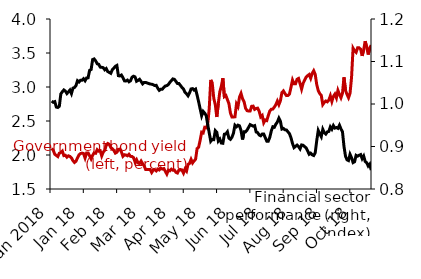
| Category | 10-Year Bond Yield |
|---|---|
| Jan 2018 | 2.099 |
| Jan 18 | 2.068 |
| Jan 18 | 2.011 |
| Jan 18 | 1.994 |
| Jan 18 | 1.977 |
| Jan 18 | 2.028 |
| Jan 18 | 2.038 |
| Jan 18 | 2.058 |
| Jan 18 | 1.991 |
| Jan 18 | 1.996 |
| Jan 18 | 1.968 |
| Jan 18 | 1.988 |
| Jan 18 | 1.979 |
| Jan 18 | 1.958 |
| Jan 18 | 1.917 |
| Jan 18 | 1.89 |
| Jan 18 | 1.908 |
| Jan 18 | 1.958 |
| Jan 18 | 2.003 |
| Jan 18 | 2.021 |
| Jan 18 | 2.028 |
| Jan 18 | 2.021 |
| Feb 18 | 1.956 |
| Feb 18 | 2.031 |
| Feb 18 | 2.031 |
| Feb 18 | 1.988 |
| Feb 18 | 1.943 |
| Feb 18 | 1.995 |
| Feb 18 | 2.033 |
| Feb 18 | 2.026 |
| Feb 18 | 2.078 |
| Feb 18 | 2.057 |
| Feb 18 | 2.063 |
| Feb 18 | 1.986 |
| Feb 18 | 2.042 |
| Feb 18 | 2.069 |
| Feb 18 | 2.143 |
| Feb 18 | 2.169 |
| Feb 18 | 2.156 |
| Feb 18 | 2.109 |
| Feb 18 | 2.093 |
| Feb 18 | 2.068 |
| Mar 18 | 2.028 |
| Mar 18 | 2.04 |
| Mar 18 | 2.082 |
| Mar 18 | 2.087 |
| Mar 18 | 2.045 |
| Mar 18 | 1.981 |
| Mar 18 | 2.004 |
| Mar 18 | 1.999 |
| Mar 18 | 1.988 |
| Mar 18 | 2.01 |
| Mar 18 | 1.98 |
| Mar 18 | 1.978 |
| Mar 18 | 1.962 |
| Mar 18 | 1.896 |
| Mar 18 | 1.932 |
| Mar 18 | 1.882 |
| Mar 18 | 1.874 |
| Mar 18 | 1.911 |
| Mar 18 | 1.873 |
| Mar 18 | 1.841 |
| Mar 18 | 1.787 |
| Mar 18 | 1.787 |
| Apr 18 | 1.787 |
| Apr 18 | 1.786 |
| Apr 18 | 1.743 |
| Apr 18 | 1.777 |
| Apr 18 | 1.784 |
| Apr 18 | 1.766 |
| Apr 18 | 1.793 |
| Apr 18 | 1.78 |
| Apr 18 | 1.808 |
| Apr 18 | 1.793 |
| Apr 18 | 1.8 |
| Apr 18 | 1.76 |
| Apr 18 | 1.719 |
| Apr 18 | 1.777 |
| Apr 18 | 1.768 |
| Apr 18 | 1.792 |
| Apr 18 | 1.776 |
| Apr 18 | 1.779 |
| Apr 18 | 1.745 |
| Apr 18 | 1.735 |
| Apr 18 | 1.78 |
| May 18 | 1.78 |
| May 18 | 1.78 |
| May 18 | 1.734 |
| May 18 | 1.793 |
| May 18 | 1.763 |
| May 18 | 1.862 |
| May 18 | 1.876 |
| May 18 | 1.935 |
| May 18 | 1.883 |
| May 18 | 1.913 |
| May 18 | 1.938 |
| May 18 | 2.095 |
| May 18 | 2.114 |
| May 18 | 2.217 |
| May 18 | 2.335 |
| May 18 | 2.325 |
| May 18 | 2.407 |
| May 18 | 2.4 |
| May 18 | 2.453 |
| May 18 | 2.682 |
| May 18 | 3.104 |
| May 18 | 3.054 |
| May 18 | 2.836 |
| Jun 18 | 2.739 |
| Jun 18 | 2.559 |
| Jun 18 | 2.758 |
| Jun 18 | 2.931 |
| Jun 18 | 3.012 |
| Jun 18 | 3.13 |
| Jun 18 | 2.859 |
| Jun 18 | 2.874 |
| Jun 18 | 2.815 |
| Jun 18 | 2.755 |
| Jun 18 | 2.617 |
| Jun 18 | 2.559 |
| Jun 18 | 2.56 |
| Jun 18 | 2.561 |
| Jun 18 | 2.751 |
| Jun 18 | 2.712 |
| Jun 18 | 2.853 |
| Jun 18 | 2.906 |
| Jun 18 | 2.828 |
| Jun 18 | 2.785 |
| Jun 18 | 2.688 |
| Jul 18 | 2.652 |
| Jul 18 | 2.647 |
| Jul 18 | 2.646 |
| Jul 18 | 2.716 |
| Jul 18 | 2.719 |
| Jul 18 | 2.671 |
| Jul 18 | 2.684 |
| Jul 18 | 2.689 |
| Jul 18 | 2.642 |
| Jul 18 | 2.56 |
| Jul 18 | 2.581 |
| Jul 18 | 2.475 |
| Jul 18 | 2.515 |
| Jul 18 | 2.506 |
| Jul 18 | 2.581 |
| Jul 18 | 2.646 |
| Jul 18 | 2.673 |
| Jul 18 | 2.675 |
| Jul 18 | 2.705 |
| Jul 18 | 2.74 |
| Jul 18 | 2.793 |
| Jul 18 | 2.74 |
| Aug 18 | 2.797 |
| Aug 18 | 2.918 |
| Aug 18 | 2.942 |
| Aug 18 | 2.904 |
| Aug 18 | 2.874 |
| Aug 18 | 2.876 |
| Aug 18 | 2.897 |
| Aug 18 | 2.997 |
| Aug 18 | 3.102 |
| Aug 18 | 3.047 |
| Aug 18 | 3.047 |
| Aug 18 | 3.114 |
| Aug 18 | 3.126 |
| Aug 18 | 3.05 |
| Aug 18 | 2.969 |
| Aug 18 | 3.054 |
| Aug 18 | 3.1 |
| Aug 18 | 3.145 |
| Aug 18 | 3.167 |
| Aug 18 | 3.184 |
| Aug 18 | 3.128 |
| Aug 18 | 3.2 |
| Aug 18 | 3.239 |
| Sep 18 | 3.186 |
| Sep 18 | 3.036 |
| Sep 18 | 2.947 |
| Sep 18 | 2.903 |
| Sep 18 | 2.877 |
| Sep 18 | 2.742 |
| Sep 18 | 2.774 |
| Sep 18 | 2.794 |
| Sep 18 | 2.782 |
| Sep 18 | 2.808 |
| Sep 18 | 2.871 |
| Sep 18 | 2.787 |
| Sep 18 | 2.861 |
| Sep 18 | 2.895 |
| Sep 18 | 2.84 |
| Sep 18 | 2.95 |
| Sep 18 | 2.891 |
| Sep 18 | 2.842 |
| Sep 18 | 2.907 |
| Sep 18 | 3.143 |
| Oct 18 | 2.95 |
| Oct 18 | 2.891 |
| Oct 18 | 2.842 |
| Oct 18 | 2.907 |
| Oct 18 | 3.143 |
| Oct 18 | 3.57 |
| Oct 18 | 3.531 |
| Oct 18 | 3.51 |
| Oct 18 | 3.577 |
| Oct 18 | 3.577 |
| Oct 18 | 3.555 |
| Oct 18 | 3.458 |
| Oct 18 | 3.545 |
| Oct 18 | 3.673 |
| Oct 18 | 3.586 |
| Oct 18 | 3.477 |
| Oct 18 | 3.576 |
| Oct 18 | 3.614 |